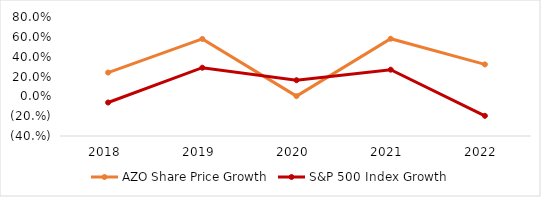
| Category | AZO Share Price Growth | S&P 500 Index Growth |
|---|---|---|
| 2018.0 | 0.24 | -0.062 |
| 2019.0 | 0.579 | 0.289 |
| 2020.0 | 0.002 | 0.163 |
| 2021.0 | 0.581 | 0.269 |
| 2022.0 | 0.322 | -0.197 |